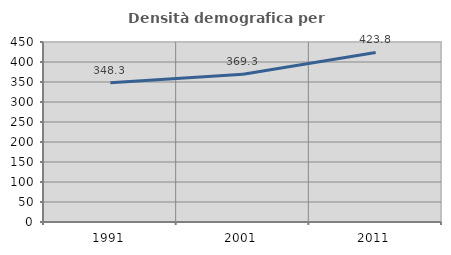
| Category | Densità demografica |
|---|---|
| 1991.0 | 348.343 |
| 2001.0 | 369.343 |
| 2011.0 | 423.817 |